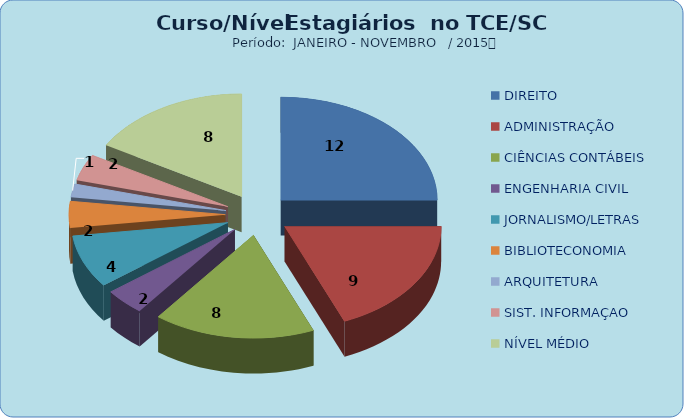
| Category | Series 0 |
|---|---|
| DIREITO | 12 |
| ADMINISTRAÇÃO | 9 |
| CIÊNCIAS CONTÁBEIS | 8 |
| ENGENHARIA CIVIL | 2 |
| JORNALISMO/LETRAS | 4 |
| BIBLIOTECONOMIA | 2 |
| ARQUITETURA | 1 |
| SIST. INFORMAÇAO | 2 |
| NÍVEL MÉDIO | 8 |